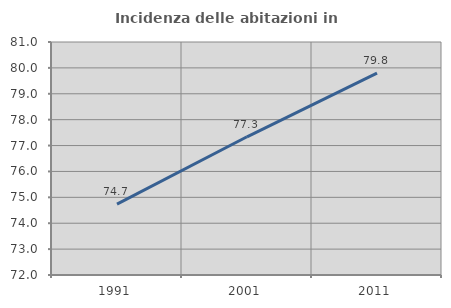
| Category | Incidenza delle abitazioni in proprietà  |
|---|---|
| 1991.0 | 74.737 |
| 2001.0 | 77.338 |
| 2011.0 | 79.8 |